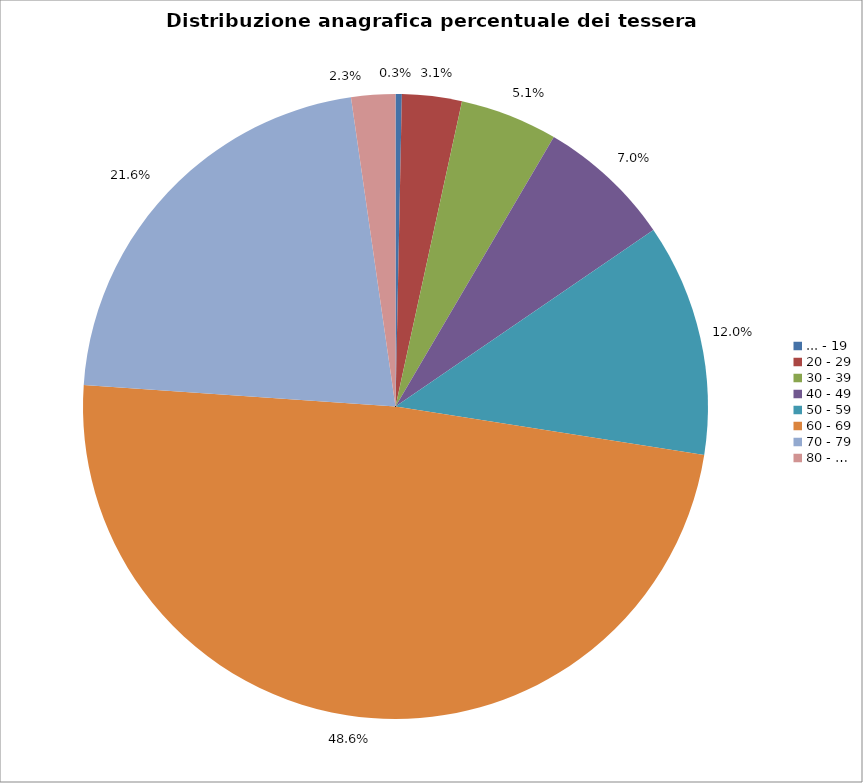
| Category | Nr. Tesserati |
|---|---|
| ... - 19 | 2 |
| 20 - 29 | 19 |
| 30 - 39 | 31 |
| 40 - 49 | 43 |
| 50 - 59 | 74 |
| 60 - 69 | 299 |
| 70 - 79 | 133 |
| 80 - … | 14 |